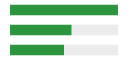
| Category | Series 0 | Series 1 |
|---|---|---|
| 0 | 1 | 0 |
| 1 | 0.571 | 0.429 |
| 2 | 0.5 | 0.5 |